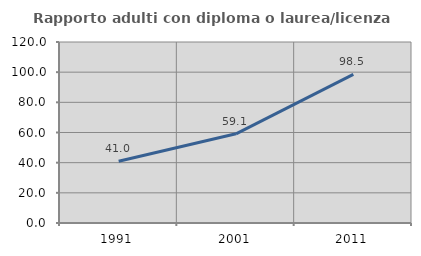
| Category | Rapporto adulti con diploma o laurea/licenza media  |
|---|---|
| 1991.0 | 40.984 |
| 2001.0 | 59.118 |
| 2011.0 | 98.528 |